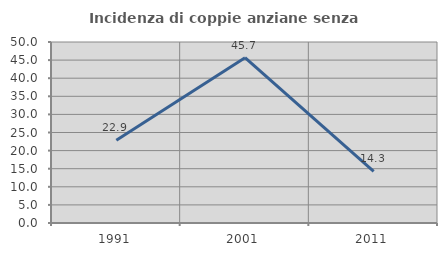
| Category | Incidenza di coppie anziane senza figli  |
|---|---|
| 1991.0 | 22.857 |
| 2001.0 | 45.652 |
| 2011.0 | 14.286 |